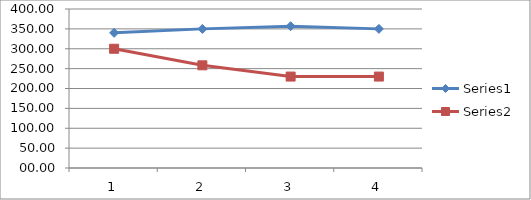
| Category | Series 0 | Series 1 |
|---|---|---|
| 0 | 340 | 300 |
| 1 | 350 | 258.33 |
| 2 | 356.66 | 230 |
| 3 | 350 | 230 |